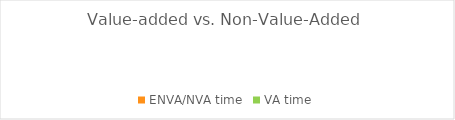
| Category | ENVA/NVA time | VA time |
|---|---|---|
| 0 | 0 | 0 |